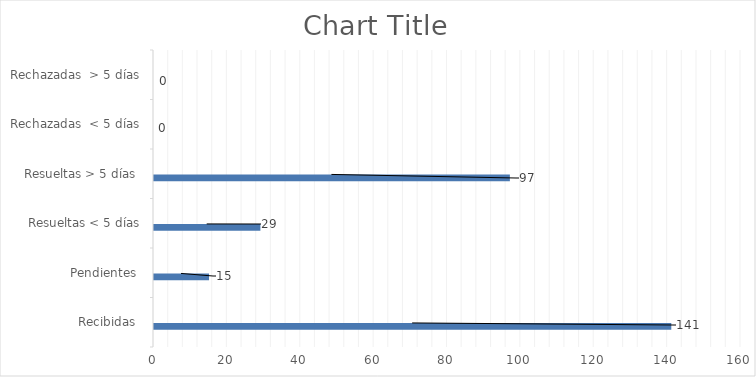
| Category | Física | PORTAL SAIP | 311 | Otras |
|---|---|---|---|---|
| Recibidas  | 0 | 141 | 0 | 0 |
| Pendientes  | 0 | 15 | 0 | 0 |
| Resueltas < 5 días | 0 | 29 | 0 | 0 |
| Resueltas > 5 días  | 0 | 97 | 0 | 0 |
| Rechazadas  < 5 días | 0 | 0 | 0 | 0 |
| Rechazadas  > 5 días | 0 | 0 | 0 | 0 |